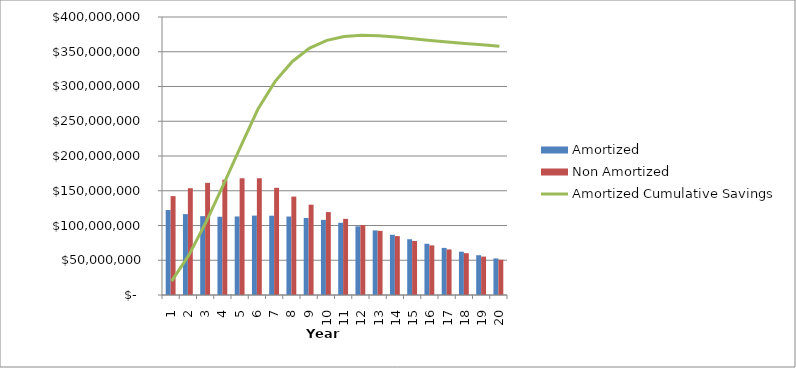
| Category | Amortized | Non Amortized |
|---|---|---|
| 0 | 122250068.508 | 142260000 |
| 1 | 116371097.21 | 153640800 |
| 2 | 113455805.731 | 161322840 |
| 3 | 112580788.149 | 165932064 |
| 4 | 113025470.998 | 168006214.8 |
| 5 | 114235117.82 | 168006214.8 |
| 6 | 114116110.06 | 154229705.186 |
| 7 | 112913658.477 | 141582869.361 |
| 8 | 110838394.395 | 129973074.074 |
| 9 | 108070688.492 | 119315281.999 |
| 10 | 103989242.626 | 109531428.876 |
| 11 | 98831459.714 | 100549851.708 |
| 12 | 92966215.769 | 92304763.868 |
| 13 | 86684887.569 | 84735773.231 |
| 14 | 80214937.194 | 77787439.826 |
| 15 | 73731344.521 | 71408869.76 |
| 16 | 67770003.229 | 65553342.44 |
| 17 | 62289029.028 | 60177968.36 |
| 18 | 57249878.104 | 55243374.954 |
| 19 | 52617082.611 | 50713418.208 |